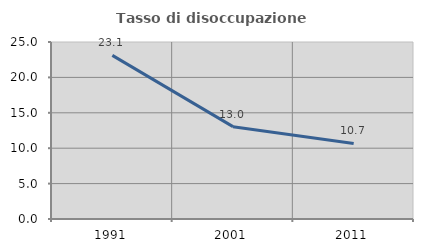
| Category | Tasso di disoccupazione giovanile  |
|---|---|
| 1991.0 | 23.106 |
| 2001.0 | 13.043 |
| 2011.0 | 10.667 |